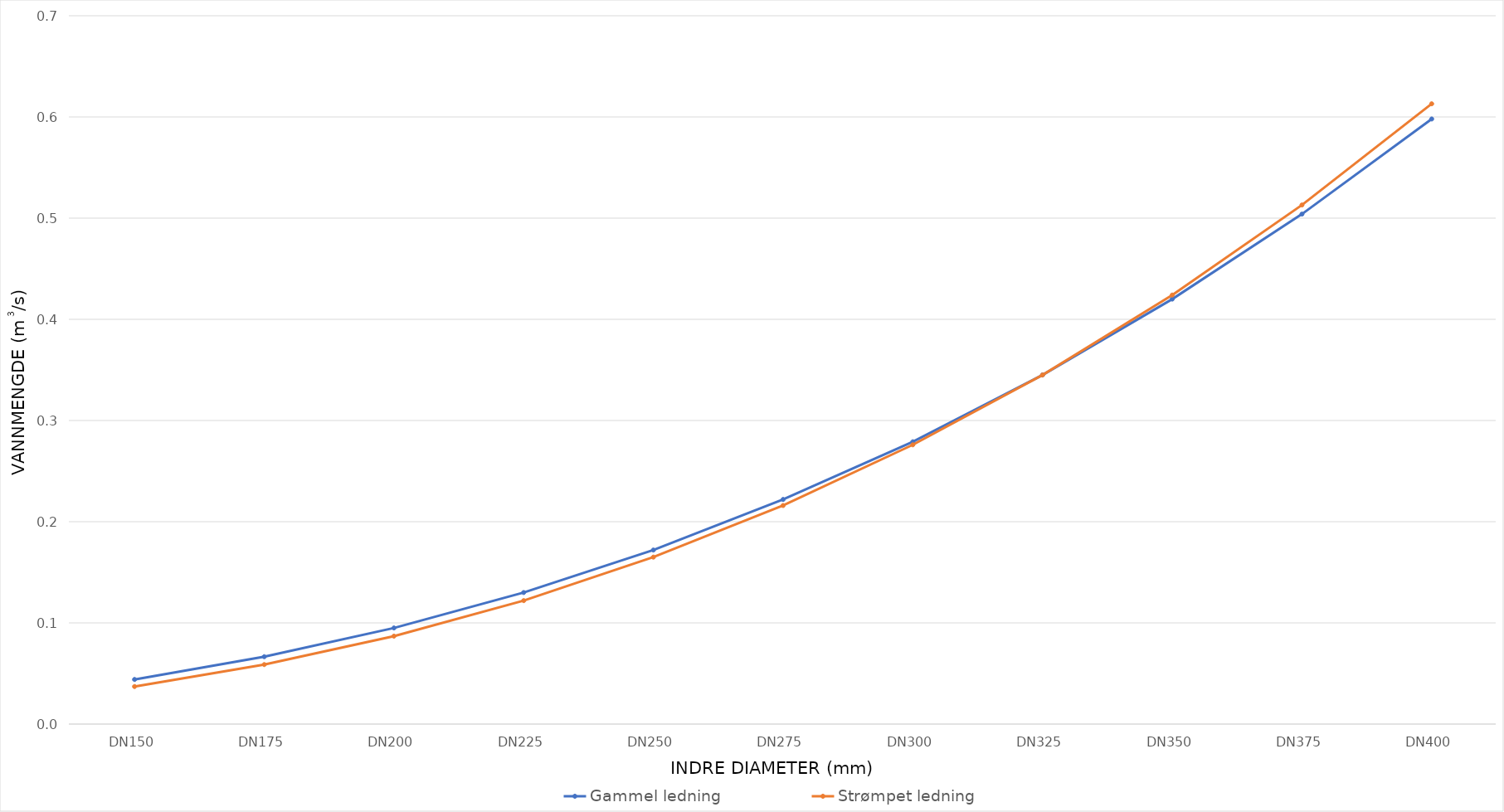
| Category | Gammel ledning | Strømpet ledning |
|---|---|---|
| DN150 | 0.044 | 0.037 |
| DN175 | 0.067 | 0.059 |
| DN200 | 0.095 | 0.087 |
| DN225 | 0.13 | 0.122 |
| DN250 | 0.172 | 0.165 |
| DN275 | 0.222 | 0.216 |
| DN300 | 0.279 | 0.276 |
| DN325 | 0.345 | 0.345 |
| DN350 | 0.42 | 0.424 |
| DN375 | 0.504 | 0.513 |
| DN400 | 0.598 | 0.613 |